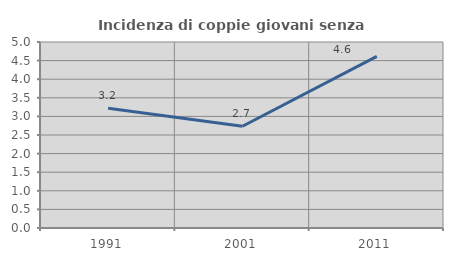
| Category | Incidenza di coppie giovani senza figli |
|---|---|
| 1991.0 | 3.216 |
| 2001.0 | 2.734 |
| 2011.0 | 4.615 |